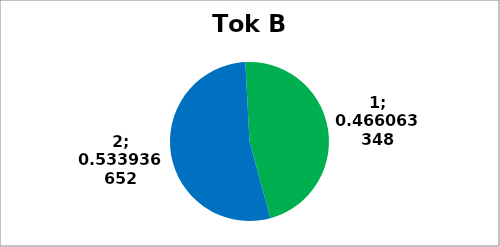
| Category | Series 0 |
|---|---|
| 0 | 103 |
| 1 | 118 |